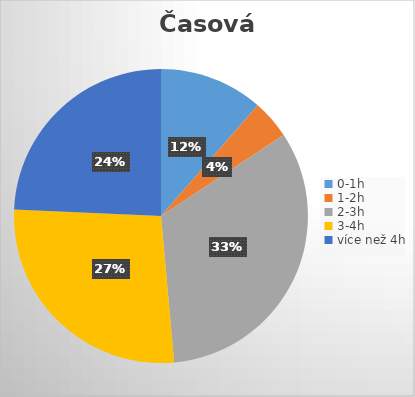
| Category | Series 0 |
|---|---|
| 0-1h | 8 |
| 1-2h | 3 |
| 2-3h | 23 |
| 3-4h | 19 |
| více než 4h | 17 |